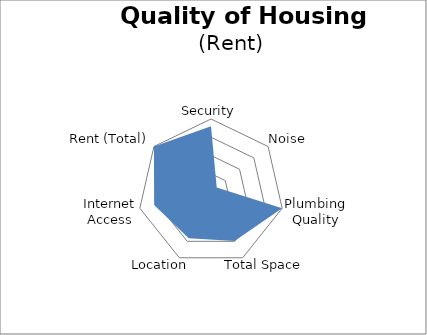
| Category | Rental Ranking |
|---|---|
| Security | 90 |
| Noise | 10 |
| Plumbing Quality | 100 |
| Total Space | 74.383 |
| Location | 70.469 |
| Internet Access | 79.891 |
| Rent (Total) | 100 |